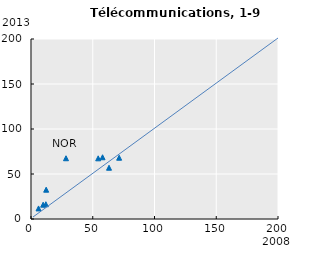
| Category | Series 0 |
|---|---|
| 54.41166414361515 | 67.417 |
| 63.178233003312485 | 56.965 |
| 6.101758474954326 | 11.74 |
| 71.36986599215813 | 68.081 |
| 12.035078309967696 | 16.394 |
| 9.834929051897678 | 15.891 |
| 12.283740007690326 | 32.569 |
| 28.32981055806441 | 67.507 |
| 57.93870343187465 | 68.616 |